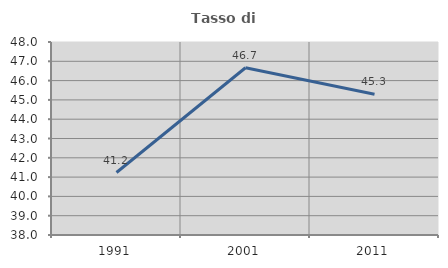
| Category | Tasso di occupazione   |
|---|---|
| 1991.0 | 41.238 |
| 2001.0 | 46.667 |
| 2011.0 | 45.292 |